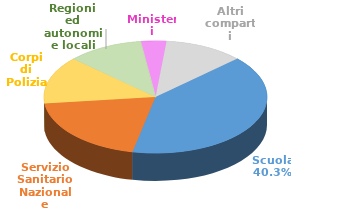
| Category | Series 0 |
|---|---|
| Scuola | 28420 |
| Servizio Sanitario Nazionale | 14017 |
| Corpi di Polizia | 9660 |
| Regioni ed autonomie locali | 7779 |
| Ministeri | 2624 |
| Altri comparti | 8108 |